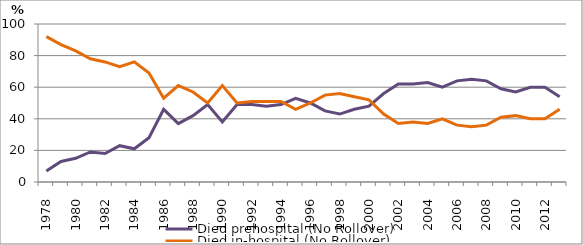
| Category | Died prehospital (No Rollover) | Died in-hospital (No Rollover) |
|---|---|---|
| 1978.0 | 7 | 92 |
| 1979.0 | 13 | 87 |
| 1980.0 | 15 | 83 |
| 1981.0 | 19 | 78 |
| 1982.0 | 18 | 76 |
| 1983.0 | 23 | 73 |
| 1984.0 | 21 | 76 |
| 1985.0 | 28 | 69 |
| 1986.0 | 46 | 53 |
| 1987.0 | 37 | 61 |
| 1988.0 | 42 | 57 |
| 1989.0 | 49 | 50 |
| 1990.0 | 38 | 61 |
| 1991.0 | 49 | 50 |
| 1992.0 | 49 | 51 |
| 1993.0 | 48 | 51 |
| 1994.0 | 49 | 51 |
| 1995.0 | 53 | 46 |
| 1996.0 | 50 | 50 |
| 1997.0 | 45 | 55 |
| 1998.0 | 43 | 56 |
| 1999.0 | 46 | 54 |
| 2000.0 | 48 | 52 |
| 2001.0 | 56 | 43 |
| 2002.0 | 62 | 37 |
| 2003.0 | 62 | 38 |
| 2004.0 | 63 | 37 |
| 2005.0 | 60 | 40 |
| 2006.0 | 64 | 36 |
| 2007.0 | 65 | 35 |
| 2008.0 | 64 | 36 |
| 2009.0 | 59 | 41 |
| 2010.0 | 57 | 42 |
| 2011.0 | 60 | 40 |
| 2012.0 | 60 | 40 |
| 2013.0 | 54 | 46 |